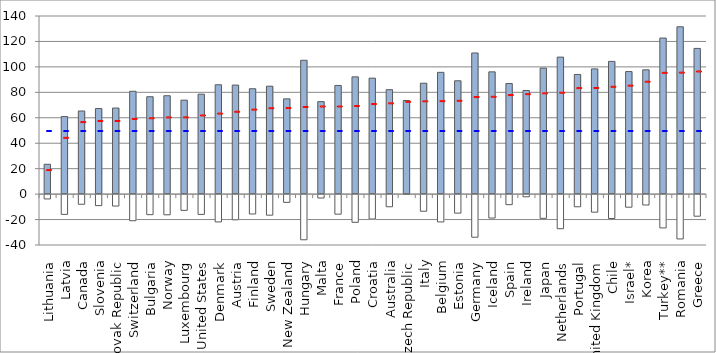
| Category | Gross Earnings | Net taxes | Net transfers |
|---|---|---|---|
| Lithuania | 23.458 | -4.181 | 0 |
| Latvia | 60.96 | -16.317 | 0 |
| Canada | 65.34 | -8.364 | 0 |
| Slovenia | 67.265 | -9.425 | 0 |
| Slovak Republic | 67.662 | -9.785 | 0 |
| Switzerland | 80.834 | -21.329 | 0 |
| Bulgaria | 76.55 | -16.543 | 0 |
| Norway | 77.337 | -16.657 | 0 |
| Luxembourg | 73.858 | -13.161 | 0 |
| United States | 78.545 | -16.339 | 0 |
| Denmark | 85.948 | -22.259 | 0 |
| Austria | 85.711 | -20.581 | 0 |
| Finland | 82.826 | -16.002 | 0 |
| Sweden | 84.828 | -16.945 | 0 |
| New Zealand | 74.875 | -6.852 | 0 |
| Hungary | 105.191 | -36.291 | 0 |
| Malta | 72.706 | -3.469 | 0 |
| France | 85.397 | -16.156 | 0 |
| Poland | 92.163 | -22.54 | 0 |
| Croatia | 91.153 | -19.965 | 0 |
| Australia | 82.088 | -10.338 | 0 |
| Czech Republic | 73.586 | -0.643 | 0 |
| Italy | 87.162 | -13.847 | 0 |
| Belgium | 95.715 | -22.277 | 0 |
| Estonia | 89.083 | -15.334 | 0 |
| Germany | 110.931 | -34.271 | 0 |
| Iceland | 96.105 | -19.198 | 0 |
| Spain | 86.909 | -8.685 | 0 |
| Ireland | 81.447 | -2.508 | 0 |
| Japan | 99.03 | -19.437 | 0 |
| Netherlands | 107.682 | -27.597 | 0 |
| Portugal | 94.052 | -10.346 | 0 |
| United Kingdom | 98.409 | -14.588 | 0 |
| Chile | 104.319 | -19.57 | 0 |
| Israel* | 96.332 | -10.682 | 0 |
| Korea | 97.702 | -8.963 | 0 |
| Turkey** | 122.678 | -26.962 | 0 |
| Romania | 131.503 | -35.619 | 0 |
| Greece | 114.521 | -17.751 | 0 |